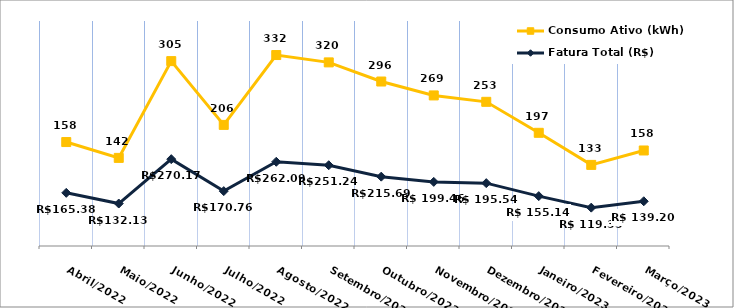
| Category | Fatura Total (R$) | Consumo Ativo (kWh) |
|---|---|---|
| Abril/2022 | 165.38 | 158 |
| Maio/2022 | 132.13 | 142 |
| Junho/2022 | 270.17 | 305 |
| Julho/2022 | 170.76 | 206 |
| Agosto/2022 | 262.09 | 332 |
| Setembro/2022 | 251.24 | 320 |
| Outubro/2022 | 215.69 | 296 |
| Novembro/2022 | 199.46 | 269 |
| Dezembro/2022 | 195.54 | 253 |
| Janeiro/2023 | 155.14 | 197 |
| Fevereiro/2023 | 119.33 | 133 |
| Março/2023 | 139.2 | 158 |